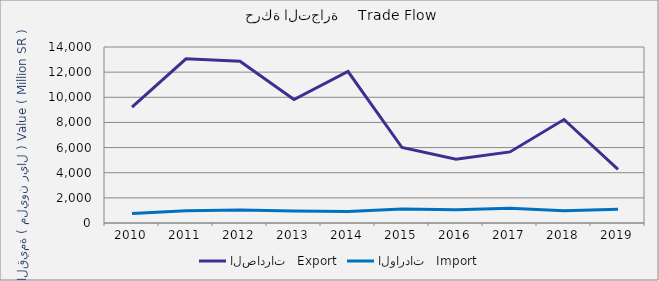
| Category | الصادرات   Export | الواردات   Import |
|---|---|---|
| 2010.0 | 9225763121 | 749702614 |
| 2011.0 | 13064417923 | 971814953 |
| 2012.0 | 12869968946 | 1030288842 |
| 2013.0 | 9818477808 | 957638426 |
| 2014.0 | 12049905492 | 921790514 |
| 2015.0 | 6003817733 | 1103973735 |
| 2016.0 | 5075331815 | 1059370888 |
| 2017.0 | 5654349323 | 1177697115 |
| 2018.0 | 8233714010 | 973161386 |
| 2019.0 | 4262354405 | 1084251903 |